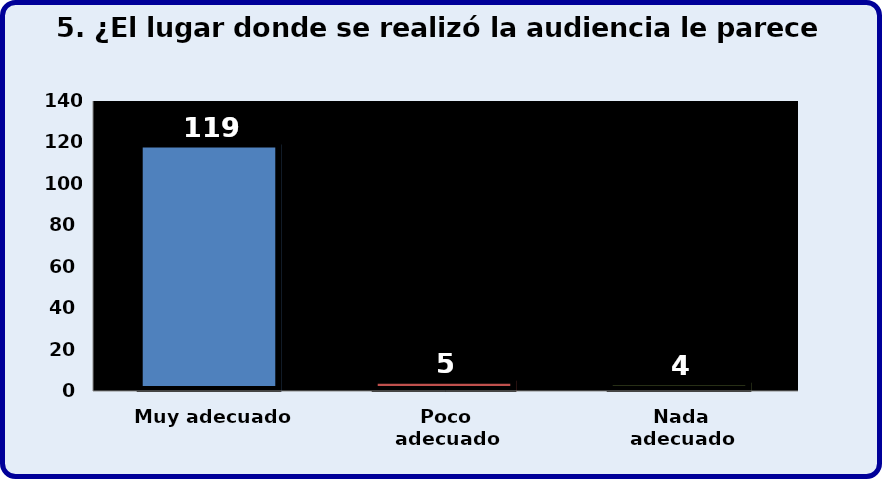
| Category | Series 0 |
|---|---|
| Muy adecuado | 119 |
| Poco adecuado | 5 |
| Nada adecuado | 4 |